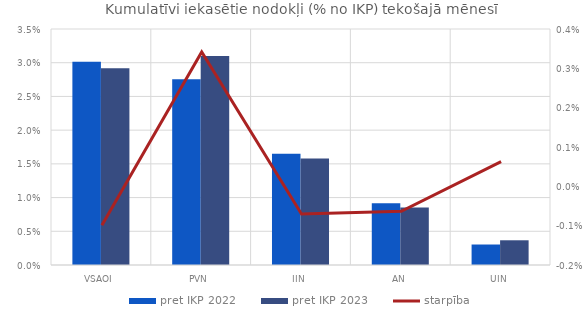
| Category | pret IKP 2022 | pret IKP 2023 |
|---|---|---|
| VSAOI | 0.03 | 0.029 |
| PVN | 0.028 | 0.031 |
| IIN | 0.017 | 0.016 |
| AN | 0.009 | 0.009 |
| UIN | 0.003 | 0.004 |